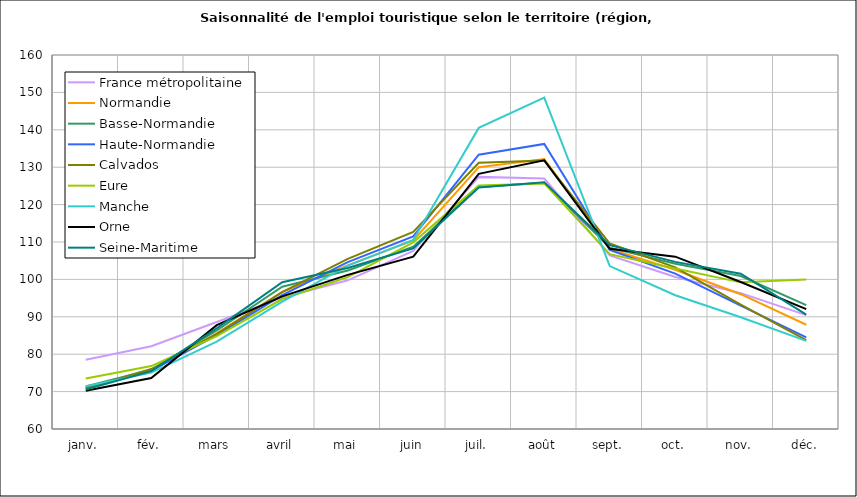
| Category | France métropolitaine | Normandie | Basse-Normandie | Haute-Normandie | Calvados | Eure | Manche | Orne | Seine-Maritime |
|---|---|---|---|---|---|---|---|---|---|
| janv. | 78.525 | 71.102 | 71.363 | 70.936 | 70.847 | 73.516 | 71.425 | 70.204 | 70.554 |
| fév. | 82.133 | 75.656 | 75.831 | 75.544 | 76.032 | 76.819 | 75.062 | 73.612 | 75.46 |
| mars | 88.614 | 85.595 | 86.34 | 85.121 | 85.452 | 84.844 | 83.339 | 87.758 | 86.902 |
| avril | 95.123 | 96.677 | 98.032 | 95.815 | 96.59 | 94.751 | 94.04 | 95.479 | 99.264 |
| mai | 99.751 | 103.744 | 102.376 | 104.615 | 105.504 | 100.597 | 103.693 | 101.205 | 103.044 |
| juin | 107.619 | 110.424 | 108.756 | 111.486 | 112.692 | 109.9 | 110.528 | 106.07 | 108.326 |
| juil. | 127.412 | 130 | 124.725 | 133.358 | 131.206 | 125.105 | 140.509 | 128.235 | 124.582 |
| août | 126.959 | 132.194 | 125.867 | 136.221 | 131.809 | 125.665 | 148.631 | 131.845 | 125.942 |
| sept. | 106.435 | 108.115 | 108.502 | 107.869 | 109.584 | 106.753 | 103.564 | 108.169 | 109.159 |
| oct. | 100.656 | 102.578 | 104.195 | 101.549 | 103.231 | 102.89 | 95.766 | 106.079 | 104.686 |
| nov. | 96.321 | 96.046 | 100.889 | 92.963 | 93.276 | 99.207 | 89.867 | 99.295 | 101.521 |
| déc. | 90.453 | 87.868 | 93.124 | 84.523 | 83.777 | 99.954 | 83.576 | 92.05 | 90.559 |